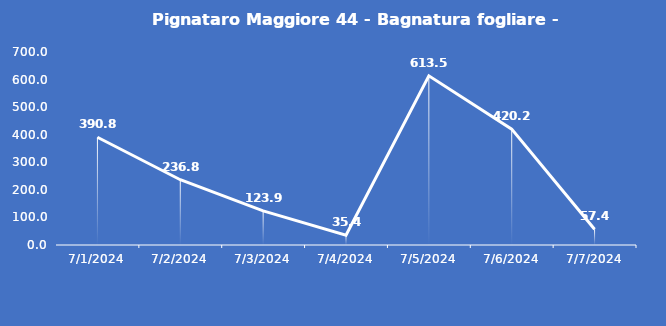
| Category | Pignataro Maggiore 44 - Bagnatura fogliare - Grezzo (min) |
|---|---|
| 7/1/24 | 390.8 |
| 7/2/24 | 236.8 |
| 7/3/24 | 123.9 |
| 7/4/24 | 35.4 |
| 7/5/24 | 613.5 |
| 7/6/24 | 420.2 |
| 7/7/24 | 57.4 |